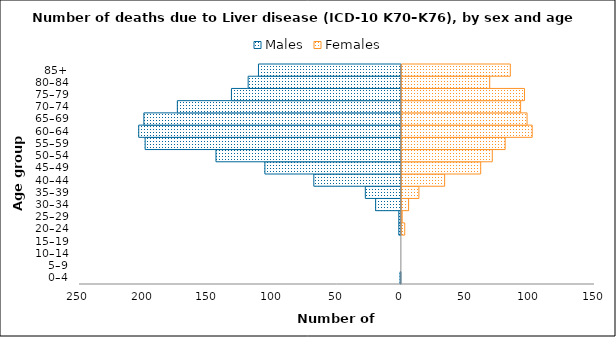
| Category | Males | Females |
|---|---|---|
| 0–4 | -1 | 0 |
| 5–9 | 0 | 0 |
| 10–14 | 0 | 0 |
| 15–19 | 0 | 0 |
| 20–24 | -2 | 3 |
| 25–29 | -2 | 1 |
| 30–34 | -20 | 6 |
| 35–39 | -28 | 14 |
| 40–44 | -68 | 34 |
| 45–49 | -106 | 62 |
| 50–54 | -144 | 71 |
| 55–59 | -199 | 81 |
| 60–64 | -204 | 102 |
| 65–69 | -200 | 98 |
| 70–74 | -174 | 93 |
| 75–79 | -132 | 96 |
| 80–84 | -119 | 69 |
| 85+ | -111 | 85 |